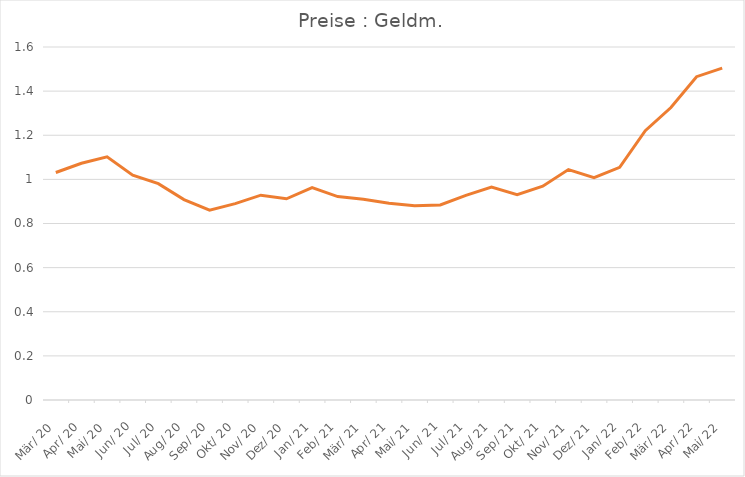
| Category | Preise : Geldm. |
|---|---|
| 1920-03-05 | 1.031 |
| 1920-04-04 12:00:00 | 1.073 |
| 1920-05-05 | 1.102 |
| 1920-06-04 12:00:00 | 1.019 |
| 1920-07-05 | 0.981 |
| 1920-08-04 12:00:00 | 0.908 |
| 1920-09-04 | 0.861 |
| 1920-10-04 12:00:00 | 0.89 |
| 1920-11-04 | 0.928 |
| 1920-12-04 12:00:00 | 0.912 |
| 1921-01-04 | 0.962 |
| 1921-02-03 12:00:00 | 0.922 |
| 1921-03-06 | 0.91 |
| 1921-04-05 12:00:00 | 0.892 |
| 1921-05-06 | 0.881 |
| 1921-06-05 12:00:00 | 0.884 |
| 1921-07-06 | 0.927 |
| 1921-08-05 12:00:00 | 0.965 |
| 1921-09-05 | 0.93 |
| 1921-10-05 12:00:00 | 0.969 |
| 1921-11-05 | 1.044 |
| 1921-12-05 12:00:00 | 1.008 |
| 1922-01-05 | 1.055 |
| 1922-02-04 12:00:00 | 1.22 |
| 1922-03-07 | 1.326 |
| 1922-04-06 12:00:00 | 1.465 |
| 1922-05-07 | 1.504 |